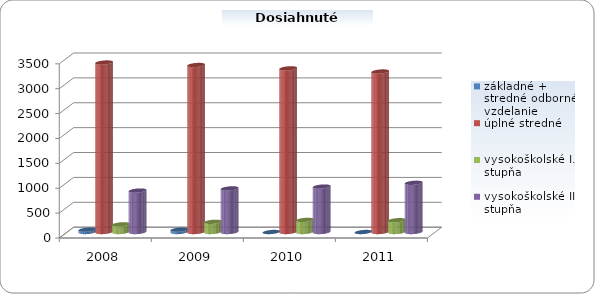
| Category | základné + stredné odborné vzdelanie | úplné stredné | vysokoškolské I. stupňa | vysokoškolské II. stupňa |
|---|---|---|---|---|
| 2008.0 | 47 | 3406 | 154 | 833 |
| 2009.0 | 47 | 3356 | 205 | 876 |
| 2010.0 | 0 | 3288 | 243 | 913 |
| 2011.0 | 0 | 3225 | 237 | 989 |